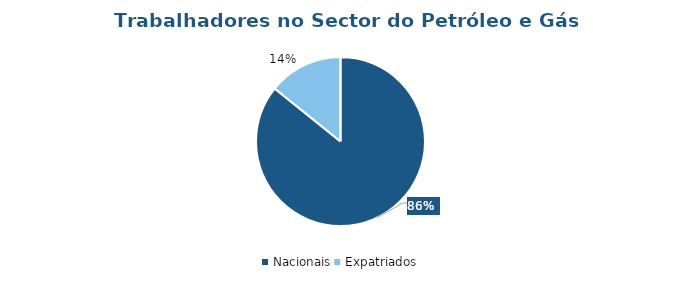
| Category | Total |
|---|---|
| Nacionais | 0.858 |
| Expatriados | 0.142 |